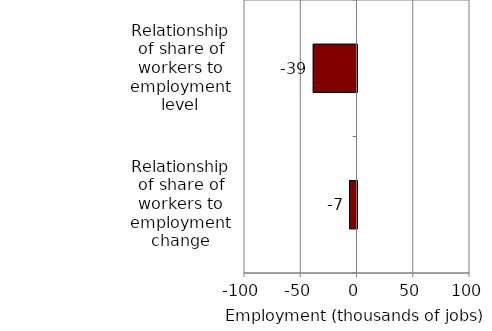
| Category | Series 0 |
|---|---|
| Relationship of share of workers to employment change | -6.67 |
| Relationship of share of workers to employment level | -38.89 |